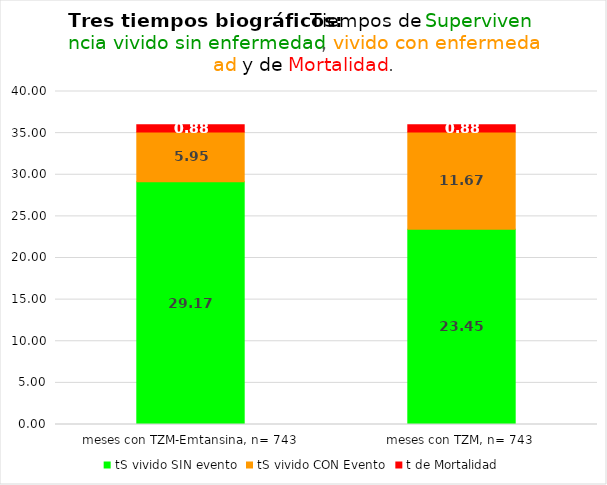
| Category | tS vivido SIN evento | tS vivido CON Evento | t de Mortalidad |
|---|---|---|---|
| meses con TZM-Emtansina, n= 743 | 29.17 | 5.953 | 0.877 |
| meses con TZM, n= 743 | 23.451 | 11.671 | 0.877 |